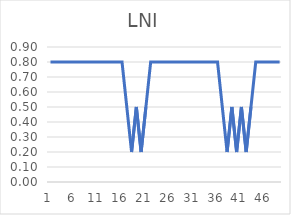
| Category | Series 0 |
|---|---|
| 0 | 0.8 |
| 1 | 0.8 |
| 2 | 0.8 |
| 3 | 0.8 |
| 4 | 0.8 |
| 5 | 0.8 |
| 6 | 0.8 |
| 7 | 0.8 |
| 8 | 0.8 |
| 9 | 0.8 |
| 10 | 0.8 |
| 11 | 0.8 |
| 12 | 0.8 |
| 13 | 0.8 |
| 14 | 0.8 |
| 15 | 0.8 |
| 16 | 0.5 |
| 17 | 0.2 |
| 18 | 0.5 |
| 19 | 0.2 |
| 20 | 0.5 |
| 21 | 0.8 |
| 22 | 0.8 |
| 23 | 0.8 |
| 24 | 0.8 |
| 25 | 0.8 |
| 26 | 0.8 |
| 27 | 0.8 |
| 28 | 0.8 |
| 29 | 0.8 |
| 30 | 0.8 |
| 31 | 0.8 |
| 32 | 0.8 |
| 33 | 0.8 |
| 34 | 0.8 |
| 35 | 0.8 |
| 36 | 0.5 |
| 37 | 0.2 |
| 38 | 0.5 |
| 39 | 0.2 |
| 40 | 0.5 |
| 41 | 0.2 |
| 42 | 0.5 |
| 43 | 0.8 |
| 44 | 0.8 |
| 45 | 0.8 |
| 46 | 0.8 |
| 47 | 0.8 |
| 48 | 0.8 |